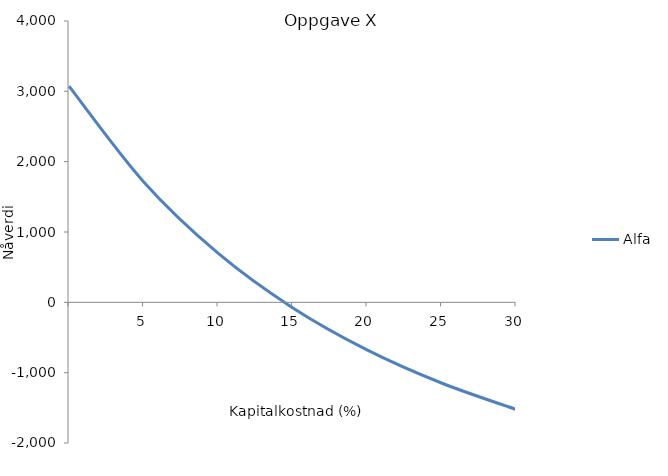
| Category | Alfa | Beta |
|---|---|---|
| nan | 3073.013 |  |
| 5.0 | 1715.239 |  |
| 10.0 | 698.631 |  |
| 15.000000000000002 | -75.916 |  |
| 20.0 | -675.59 |  |
| 25.0 | -1146.811 |  |
| 30.0 | -1522.217 |  |